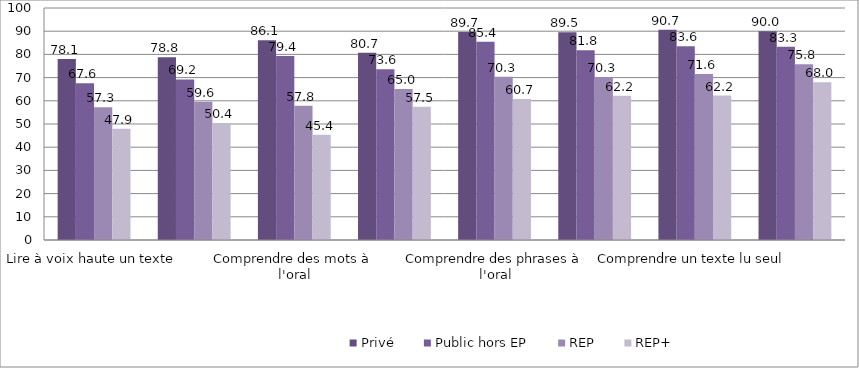
| Category | Privé | Public hors EP | REP | REP+ |
|---|---|---|---|---|
| Lire à voix haute un texte | 78.07 | 67.58 | 57.27 | 47.92 |
| Lire à voix haute des mots | 78.76 | 69.2 | 59.59 | 50.39 |
| Comprendre des mots à l'oral | 86.08 | 79.36 | 57.83 | 45.41 |
| Ecrire des mots dictés | 80.73 | 73.55 | 65.04 | 57.47 |
| Comprendre des phrases à l'oral | 89.67 | 85.42 | 70.34 | 60.74 |
| Comprendre des phrases lues seul | 89.53 | 81.79 | 70.26 | 62.19 |
| Comprendre un texte lu seul | 90.66 | 83.55 | 71.57 | 62.24 |
| Ecrire des syllabes  | 90.03 | 83.32 | 75.75 | 67.95 |